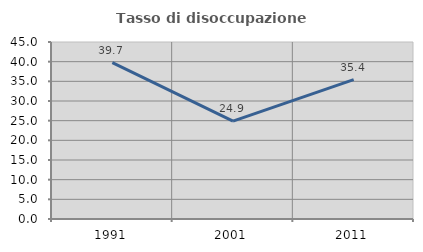
| Category | Tasso di disoccupazione giovanile  |
|---|---|
| 1991.0 | 39.744 |
| 2001.0 | 24.865 |
| 2011.0 | 35.417 |